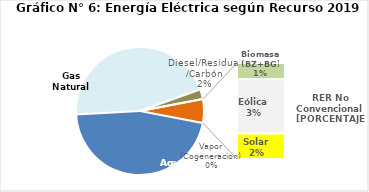
| Category | Series 0 |
|---|---|
| Agua | 2218.756 |
| Gas Natural | 2180.544 |
| Diesel/Residual/Carbón | 119.961 |
| Vapor (Cogeneracion) | 0.367 |
| Biomasa (BZ+BG) | 49.228 |
| Eólica | 162.893 |
| Solar | 77.096 |